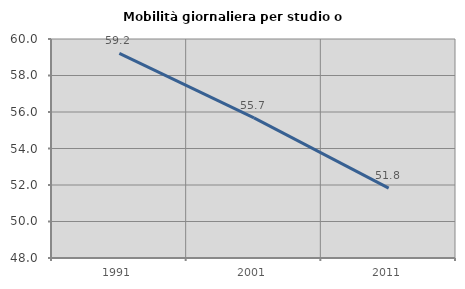
| Category | Mobilità giornaliera per studio o lavoro |
|---|---|
| 1991.0 | 59.214 |
| 2001.0 | 55.682 |
| 2011.0 | 51.825 |